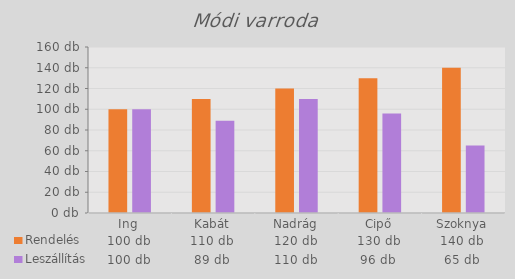
| Category | Rendelés | Leszállítás |
|---|---|---|
| Ing | 100 | 100 |
| Kabát | 110 | 89 |
| Nadrág | 120 | 110 |
| Cipő | 130 | 96 |
| Szoknya | 140 | 65 |